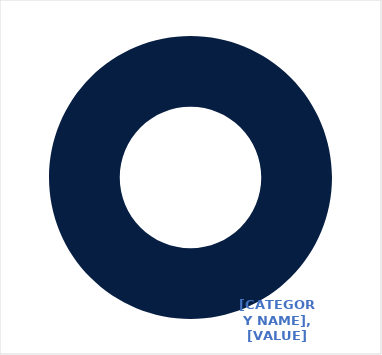
| Category | Series 0 |
|---|---|
| Sydney | 1 |